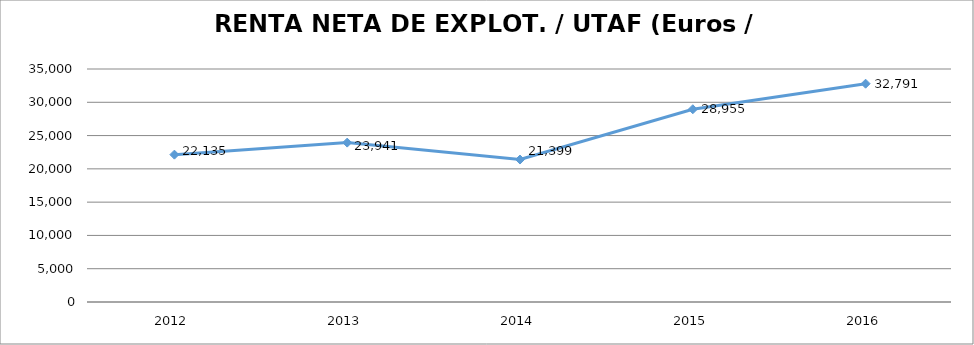
| Category | 2012 |
|---|---|
| 2012.0 | 22135.292 |
| 2013.0 | 23940.703 |
| 2014.0 | 21399.089 |
| 2015.0 | 28955.232 |
| 2016.0 | 32791.4 |